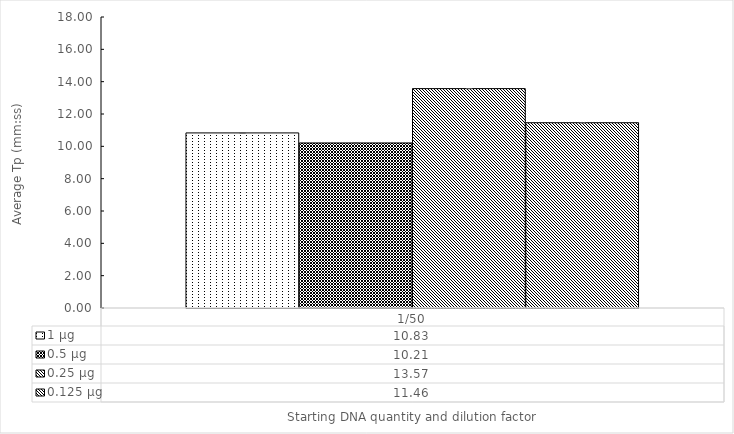
| Category | 1 µg | 0.5 µg | 0.25 µg | 0.125 µg |
|---|---|---|---|---|
| 1/50 | 10.83 | 10.21 | 13.57 | 11.46 |